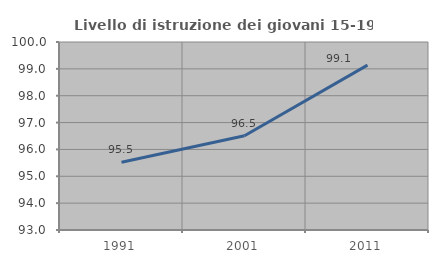
| Category | Livello di istruzione dei giovani 15-19 anni |
|---|---|
| 1991.0 | 95.522 |
| 2001.0 | 96.512 |
| 2011.0 | 99.138 |